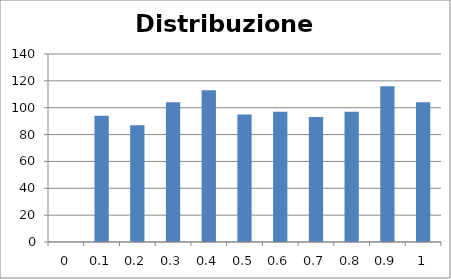
| Category | Series 0 |
|---|---|
| 0.0 | 0 |
| 0.1 | 94 |
| 0.2 | 87 |
| 0.3 | 104 |
| 0.4 | 113 |
| 0.5 | 95 |
| 0.6 | 97 |
| 0.7 | 93 |
| 0.8 | 97 |
| 0.9 | 116 |
| 1.0 | 104 |